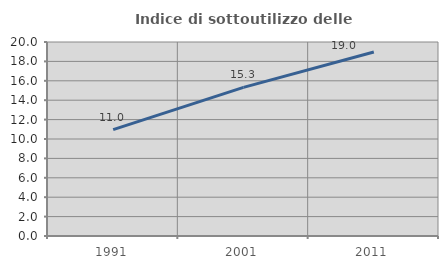
| Category | Indice di sottoutilizzo delle abitazioni  |
|---|---|
| 1991.0 | 10.96 |
| 2001.0 | 15.318 |
| 2011.0 | 18.966 |